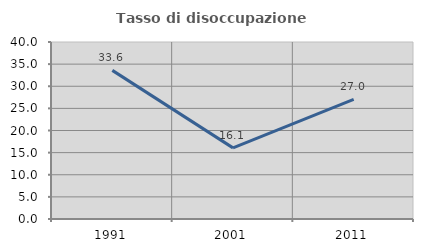
| Category | Tasso di disoccupazione giovanile  |
|---|---|
| 1991.0 | 33.588 |
| 2001.0 | 16.071 |
| 2011.0 | 27.027 |